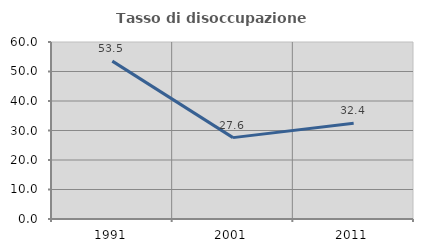
| Category | Tasso di disoccupazione giovanile  |
|---|---|
| 1991.0 | 53.521 |
| 2001.0 | 27.586 |
| 2011.0 | 32.432 |